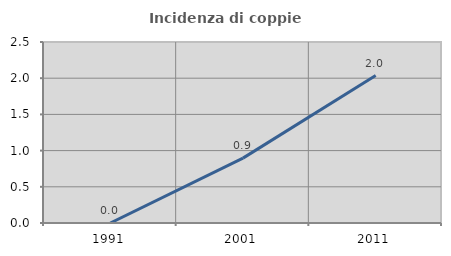
| Category | Incidenza di coppie miste |
|---|---|
| 1991.0 | 0 |
| 2001.0 | 0.896 |
| 2011.0 | 2.036 |